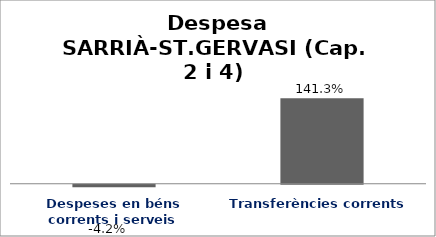
| Category | Series 0 |
|---|---|
| Despeses en béns corrents i serveis | -0.042 |
| Transferències corrents | 1.413 |